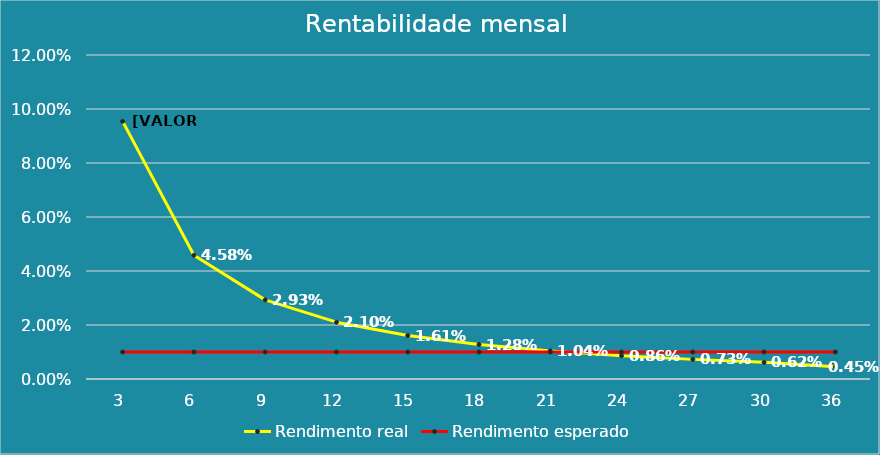
| Category | Rendimento real | Rendimento esperado |
|---|---|---|
| 3.0 | 0.095 | 0.01 |
| 6.0 | 0.046 | 0.01 |
| 9.0 | 0.029 | 0.01 |
| 12.0 | 0.021 | 0.01 |
| 15.0 | 0.016 | 0.01 |
| 18.0 | 0.013 | 0.01 |
| 21.0 | 0.01 | 0.01 |
| 24.0 | 0.009 | 0.01 |
| 27.0 | 0.007 | 0.01 |
| 30.0 | 0.006 | 0.01 |
| 36.0 | 0.005 | 0.01 |